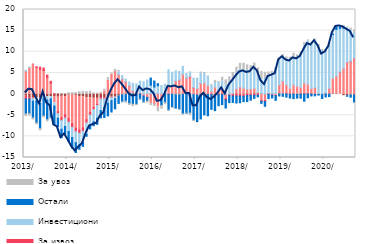
| Category | По трансакционим рачунима | За ликвидност и обртна средства  | За извоз | Инвестициони | Остали | За увоз |
|---|---|---|---|---|---|---|
| 2013-01-01 | -0.509 | 5.466 | -0.655 | 0.157 | -3.557 | -0.62 |
| 2013-02-01 | -0.821 | 6.307 | -0.351 | 0.101 | -3.442 | -0.636 |
| 2013-03-01 | -0.908 | 7.144 | -0.174 | -0.604 | -3.955 | -0.473 |
| 2013-04-01 | -0.906 | 6.265 | 0.188 | -0.805 | -5.11 | -0.441 |
| 2013-05-01 | -1.028 | 5.791 | 0.566 | -1.205 | -5.942 | -0.539 |
| 2013-06-01 | -0.715 | 5.566 | 0.59 | -0.246 | -4.209 | -0.467 |
| 2013-07-01 | -0.656 | 3.962 | 0.527 | -0.788 | -4.619 | -0.522 |
| 2013-08-01 | -0.571 | 2.543 | 0.475 | -0.574 | -4.455 | -0.211 |
| 2013-09-01 | -0.597 | -1.463 | 0.046 | -0.788 | -4.325 | -0.17 |
| 2013-10-01 | -0.731 | -3.405 | -0.479 | -1.101 | -1.998 | -0.034 |
| 2013-11-01 | -0.534 | -5.012 | -0.697 | -2.071 | -1.999 | 0.032 |
| 2013-12-01 | -0.631 | -4.25 | -0.793 | -2 | -1.812 | 0.042 |
| 2014-01-01 | -0.248 | -5.468 | -0.921 | -2.223 | -2.314 | 0.338 |
| 2014-02-01 | -0.244 | -6.677 | -0.967 | -2.397 | -2.478 | 0.345 |
| 2014-03-01 | -0.312 | -7.664 | -0.914 | -2.634 | -2.299 | 0.368 |
| 2014-04-01 | -0.598 | -7.82 | -0.878 | -2.779 | -0.977 | 0.561 |
| 2014-05-01 | -0.678 | -7.271 | -0.835 | -2.63 | -0.953 | 0.634 |
| 2014-06-01 | -0.89 | -5.133 | -0.763 | -2.735 | -0.458 | 0.61 |
| 2014-07-01 | -0.861 | -3.427 | -0.672 | -2.518 | -0.758 | 0.681 |
| 2014-08-01 | -1.004 | -2.174 | -0.467 | -2.918 | -0.917 | 0.276 |
| 2014-09-01 | -1.021 | -1.308 | -0.375 | -3.018 | -1.426 | 0.243 |
| 2014-10-01 | -0.819 | 0.161 | -0.34 | -2.752 | -1.718 | 0.247 |
| 2014-11-01 | -0.858 | 0.695 | -0.279 | -2.093 | -2.317 | 0.459 |
| 2014-12-01 | -0.577 | 3.263 | -0.264 | -1.35 | -2.967 | 0.625 |
| 2015-01-01 | -0.712 | 4.673 | -0.142 | -0.704 | -2.68 | 0.34 |
| 2015-02-01 | -0.565 | 5.321 | -0.111 | -0.407 | -2.409 | 0.553 |
| 2015-03-01 | -0.434 | 4.59 | 0.008 | 0.669 | -1.773 | 0.324 |
| 2015-04-01 | -0.175 | 3.498 | 0.044 | 0.845 | -1.638 | -0.132 |
| 2015-05-01 | -0.054 | 2.82 | 0.068 | 0.654 | -1.651 | -0.488 |
| 2015-06-01 | 0.05 | 1.84 | 0.063 | 0.904 | -2.258 | -0.459 |
| 2015-07-01 | 0.129 | 0.502 | 0.07 | 1.849 | -2.403 | -0.592 |
| 2015-08-01 | 0.104 | 0.009 | -0.067 | 2.291 | -2.376 | -0.307 |
| 2015-09-01 | 0.112 | 0.208 | -0.055 | 2.751 | -1.148 | -0.214 |
| 2015-10-01 | 0.038 | -0.411 | -0.06 | 2.883 | -1.421 | -0.215 |
| 2015-11-01 | 0.131 | -0.703 | -0.076 | 3.2 | -0.895 | -0.44 |
| 2015-12-01 | 0.06 | -2.198 | 0.008 | 2.045 | 1.664 | -0.542 |
| 2016-01-01 | 0.112 | -2.269 | -0.03 | 1.566 | 1.404 | -0.65 |
| 2016-02-01 | 0.086 | -3.097 | 0.005 | 1.894 | 0.462 | -1.069 |
| 2016-03-01 | 0.054 | -1.187 | -0.022 | 1.97 | -1.494 | -0.878 |
| 2016-04-01 | 0.002 | 0.259 | -0.024 | 2.055 | -1.952 | -0.542 |
| 2016-05-01 | -0.049 | 2.232 | -0.014 | 3.525 | -3.719 | -0.201 |
| 2016-06-01 | -0.049 | 2.038 | 0.004 | 3.11 | -3.101 | -0.262 |
| 2016-07-01 | -0.188 | 3.046 | 0.004 | 2.456 | -3.237 | -0.159 |
| 2016-08-01 | -0.222 | 3.353 | 0.003 | 1.994 | -3.361 | -0.259 |
| 2016-09-01 | -0.107 | 4.637 | 0.003 | 1.923 | -4.549 | -0.209 |
| 2016-10-01 | -0.069 | 3.752 | 0.02 | 1.099 | -4.471 | -0.197 |
| 2016-11-01 | 0.003 | 4.032 | 0.118 | 1.076 | -4.499 | -0.6 |
| 2016-12-01 | -0.126 | 1.493 | 0.07 | 2.199 | -6.059 | -0.332 |
| 2017-01-01 | -0.287 | 1.255 | 0.034 | 2.468 | -6.239 | 0.016 |
| 2017-02-01 | -0.028 | 2.502 | 0.033 | 2.337 | -5.845 | 0.328 |
| 2017-03-01 | -0.212 | 2.639 | -0.061 | 2.218 | -4.66 | 0.242 |
| 2017-04-01 | 0.006 | 1.986 | -0.118 | 2.178 | -5.005 | 0.123 |
| 2017-05-01 | -0.021 | 0.622 | -0.131 | 1.488 | -3.457 | 0.202 |
| 2017-06-01 | -0.058 | 1.637 | -0.146 | 1.1 | -3.715 | 0.504 |
| 2017-07-01 | 0.066 | 0.742 | -0.146 | 1.936 | -2.615 | 0.257 |
| 2017-08-01 | 0.095 | 1.091 | -0.147 | 1.891 | -2.348 | 0.891 |
| 2017-09-01 | -0.033 | -1.003 | -0.338 | 2.229 | -1.931 | 1.128 |
| 2017-10-01 | 0.035 | -0.002 | -0.349 | 2.95 | -1.675 | 1.076 |
| 2017-11-01 | -0.038 | 0.191 | -0.423 | 3.298 | -1.519 | 1.614 |
| 2017-12-01 | 0.111 | 1.115 | -0.472 | 3.68 | -1.636 | 1.452 |
| 2018-01-01 | -0.017 | 1.678 | -0.449 | 4.093 | -1.582 | 1.485 |
| 2018-02-01 | -0.076 | 1.395 | -0.446 | 4.432 | -1.275 | 1.464 |
| 2018-03-01 | 0.181 | 0.968 | -0.353 | 4.465 | -1.426 | 1.286 |
| 2018-04-01 | 0.071 | 1.103 | -0.297 | 4.181 | -1.141 | 1.381 |
| 2018-05-01 | 0.137 | 1.251 | -0.296 | 4.4 | -0.726 | 1.574 |
| 2018-06-01 | 0.284 | 0.134 | -0.277 | 4.559 | -0.377 | 1.191 |
| 2018-07-01 | 0.145 | -1.444 | -0.282 | 3.523 | -0.476 | 1.691 |
| 2018-08-01 | 0.047 | -1.482 | -0.277 | 3.826 | -1.138 | 1.281 |
| 2018-09-01 | 0.187 | 0.07 | -0.088 | 3.999 | -0.981 | 0.962 |
| 2018-10-01 | 0.165 | -0.154 | -0.086 | 4.312 | -0.67 | 0.902 |
| 2018-11-01 | 0.151 | -0.294 | -0.083 | 5.778 | -1.1 | 0.383 |
| 2018-12-01 | 0.121 | 2.002 | 0.005 | 5.72 | -0.449 | 0.69 |
| 2019-01-01 | 0.084 | 2.964 | 0.003 | 5.799 | -0.532 | 0.511 |
| 2019-02-01 | 0.122 | 2.071 | -0.001 | 6.112 | -0.71 | 0.483 |
| 2019-03-01 | -0.043 | 1.384 | -0.007 | 6.432 | -0.89 | 0.926 |
| 2019-04-01 | -0.017 | 2.209 | -0.007 | 6.458 | -1.061 | 0.975 |
| 2019-05-01 | -0.065 | 1.864 | -0.007 | 6.82 | -0.881 | 0.597 |
| 2019-06-01 | 0.071 | 1.52 | -0.011 | 7.649 | -0.954 | 0.599 |
| 2019-07-01 | 0.174 | 2.439 | -0.011 | 8.965 | -1.672 | 0.577 |
| 2019-08-01 | 0.114 | 2.222 | -0.011 | 10.233 | -0.877 | 0.238 |
| 2019-09-01 | 0.013 | 1.329 | -0.011 | 10.479 | -0.423 | 0.206 |
| 2019-10-31 | -0.066 | 1.541 | -0.01 | 11.047 | -0.342 | 0.436 |
| 2019-11-30 | -0.091 | 0.084 | -0.01 | 10.759 | -0.137 | 0.843 |
| 2019-12-31 | -0.112 | -0.022 | -0.01 | 10.098 | -0.896 | 0.408 |
| 2020-01-31 | 0.054 | 0.141 | -0.01 | 9.923 | -0.677 | 0.532 |
| 2020-02-29 | -0.038 | 1.384 | -0.005 | 9.987 | -0.557 | 0.483 |
| 2020-03-31 | 0.142 | 3.609 | 0 | 10.341 | 0.142 | 0.224 |
| 2020-04-30 | 0.16 | 4.087 | 0 | 11.041 | 0.559 | 0.149 |
| 2020-05-31 | -0.034 | 5.187 | 0.005 | 10.338 | 0.308 | 0.306 |
| 2020-06-30 | -0.38 | 6.042 | 0.022 | 9.534 | 0.223 | 0.414 |
| 2020-07-31 | -0.388 | 7.439 | 0.076 | 8.138 | -0.127 | 0.2 |
| 2020-08-31 | -0.211 | 7.694 | 0.075 | 7.348 | -0.512 | 0.459 |
| 2020-09-30 | -0.276 | 8.456 | 0.072 | 6.174 | -1.624 | 0.508 |